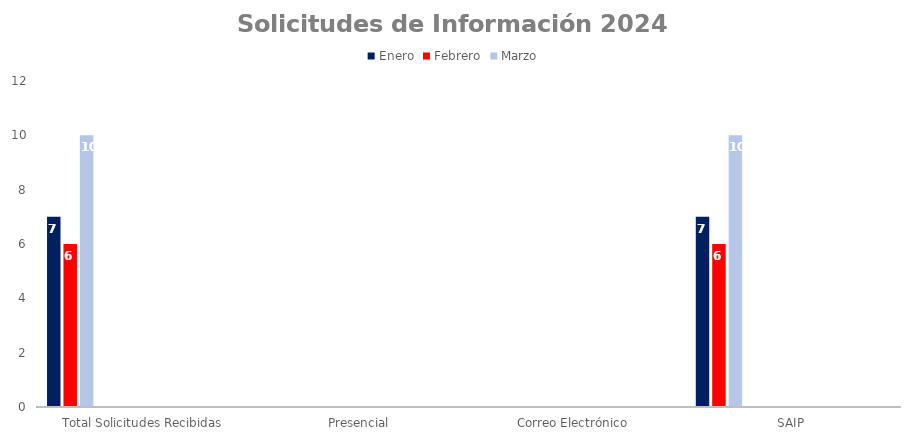
| Category | Enero | Febrero | Marzo | Abril | Mayo | Junio | Julio | Agosto | Septiembre | Octubre | Noviembre | Diciembre |
|---|---|---|---|---|---|---|---|---|---|---|---|---|
| Total Solicitudes Recibidas | 7 | 6 | 10 | 0 | 0 | 0 | 0 | 0 | 0 | 0 | 0 | 0 |
| Presencial | 0 | 0 | 0 | 0 | 0 | 0 | 0 | 0 | 0 | 0 | 0 | 0 |
| Correo Electrónico  | 0 | 0 | 0 | 0 | 0 | 0 | 0 | 0 | 0 | 0 | 0 | 0 |
| SAIP | 7 | 6 | 10 | 0 | 0 | 0 | 0 | 0 | 0 | 0 | 0 | 0 |